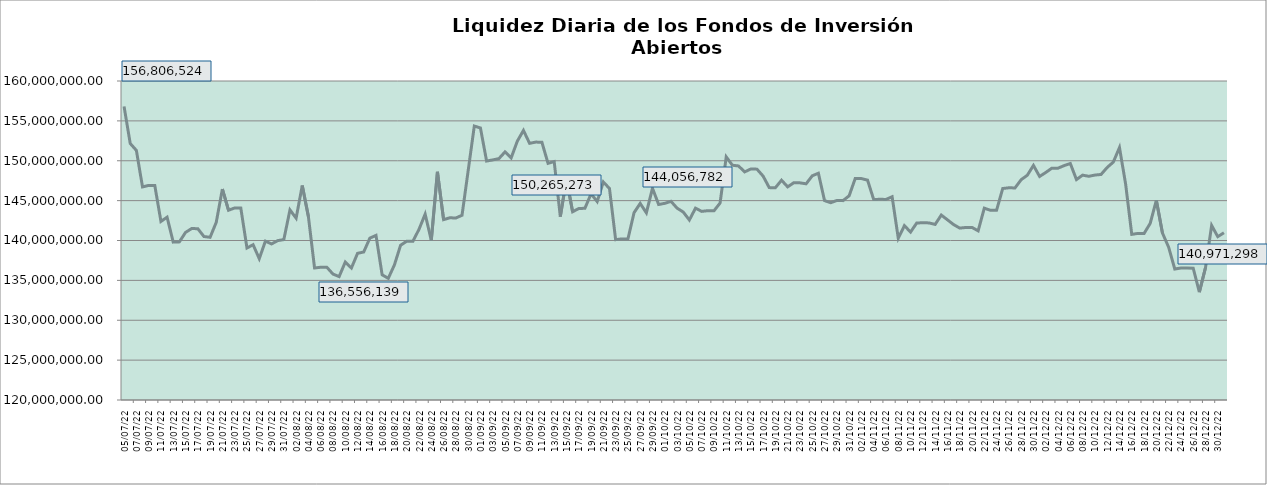
| Category | Series 0 |
|---|---|
| 2022-07-05 | 156806524.49 |
| 2022-07-06 | 152166188.48 |
| 2022-07-07 | 151298427.46 |
| 2022-07-08 | 146718388.68 |
| 2022-07-09 | 146906560.5 |
| 2022-07-10 | 146895893.61 |
| 2022-07-11 | 142390484.34 |
| 2022-07-12 | 142924126.91 |
| 2022-07-13 | 139798512.51 |
| 2022-07-14 | 139826772.85 |
| 2022-07-15 | 141012376.84 |
| 2022-07-16 | 141499989.51 |
| 2022-07-17 | 141481194.86 |
| 2022-07-18 | 140498568.48 |
| 2022-07-19 | 140401207.74 |
| 2022-07-20 | 142275364.88 |
| 2022-07-21 | 146450587.38 |
| 2022-07-22 | 143794474.76 |
| 2022-07-23 | 144080825.08 |
| 2022-07-24 | 144062047.68 |
| 2022-07-25 | 139060510.76 |
| 2022-07-26 | 139471590.52 |
| 2022-07-27 | 137721302.91 |
| 2022-07-28 | 139919280.78 |
| 2022-07-29 | 139568736.89 |
| 2022-07-30 | 139982933.86 |
| 2022-07-31 | 140114452.78 |
| 2022-08-01 | 143840545.85 |
| 2022-08-02 | 142799577.05 |
| 2022-08-03 | 146891267.79 |
| 2022-08-04 | 142993752.64 |
| 2022-08-05 | 136556139.26 |
| 2022-08-06 | 136644296.55 |
| 2022-08-07 | 136646424 |
| 2022-08-08 | 135790833.37 |
| 2022-08-09 | 135475605.73 |
| 2022-08-10 | 137296693.81 |
| 2022-08-11 | 136549063.65 |
| 2022-08-12 | 138392201.22 |
| 2022-08-13 | 138557442.07 |
| 2022-08-14 | 140298226.49 |
| 2022-08-15 | 140639460.73 |
| 2022-08-16 | 135699179.74 |
| 2022-08-17 | 135253716.22 |
| 2022-08-18 | 136946666.9 |
| 2022-08-19 | 139398234.34 |
| 2022-08-20 | 139913342.51 |
| 2022-08-21 | 139893093.17 |
| 2022-08-22 | 141401922.07 |
| 2022-08-23 | 143307196.57 |
| 2022-08-24 | 140014899.02 |
| 2022-08-25 | 148618197.67 |
| 2022-08-26 | 142614612.37 |
| 2022-08-27 | 142845230.55 |
| 2022-08-28 | 142826122.8 |
| 2022-08-29 | 143162664.18 |
| 2022-08-30 | 148752461.69 |
| 2022-08-31 | 154351717.34 |
| 2022-09-01 | 154109551.04 |
| 2022-09-02 | 149965279.33 |
| 2022-09-03 | 150103575.44 |
| 2022-09-04 | 150265272.84 |
| 2022-09-05 | 151110944.7 |
| 2022-09-06 | 150364806.53 |
| 2022-09-07 | 152452636.39 |
| 2022-09-08 | 153801304.58 |
| 2022-09-09 | 152182406.54 |
| 2022-09-10 | 152340161.14 |
| 2022-09-11 | 152320029.52 |
| 2022-09-12 | 149676135.33 |
| 2022-09-13 | 149897021.93 |
| 2022-09-14 | 142993666.96 |
| 2022-09-15 | 147711222.15 |
| 2022-09-16 | 143604340.44 |
| 2022-09-17 | 144009366.86 |
| 2022-09-18 | 144038638.79 |
| 2022-09-19 | 145851322 |
| 2022-09-20 | 144882262.01 |
| 2022-09-21 | 147337894.96 |
| 2022-09-22 | 146519809.95 |
| 2022-09-23 | 140106782.07 |
| 2022-09-24 | 140203168.66 |
| 2022-09-25 | 140184088.24 |
| 2022-09-26 | 143491403.5 |
| 2022-09-27 | 144647310.78 |
| 2022-09-28 | 143469891.15 |
| 2022-09-29 | 146545567.56 |
| 2022-09-30 | 144514338.96 |
| 2022-10-01 | 144660654.28 |
| 2022-10-02 | 144917777.94 |
| 2022-10-03 | 144056782.41 |
| 2022-10-04 | 143572072.46 |
| 2022-10-05 | 142571347.79 |
| 2022-10-06 | 144054181.07 |
| 2022-10-07 | 143652729.83 |
| 2022-10-08 | 143736829.45 |
| 2022-10-09 | 143717656.38 |
| 2022-10-10 | 144699658.01 |
| 2022-10-11 | 150488722.43 |
| 2022-10-12 | 149437572.09 |
| 2022-10-13 | 149347181.4 |
| 2022-10-14 | 148602831.69 |
| 2022-10-15 | 148966579.89 |
| 2022-10-16 | 148947351.74 |
| 2022-10-17 | 148077262.92 |
| 2022-10-18 | 146631015.7 |
| 2022-10-19 | 146618444.62 |
| 2022-10-20 | 147560039.78 |
| 2022-10-21 | 146726350.66 |
| 2022-10-22 | 147247023.63 |
| 2022-10-23 | 147227803.76 |
| 2022-10-24 | 147109384.11 |
| 2022-10-25 | 148110888.57 |
| 2022-10-26 | 148434854.82 |
| 2022-10-27 | 145004218.31 |
| 2022-10-28 | 144737486.31 |
| 2022-10-29 | 145018412.42 |
| 2022-10-30 | 144999232.06 |
| 2022-10-31 | 145601679.76 |
| 2022-11-01 | 147785182.69 |
| 2022-11-02 | 147764108.94 |
| 2022-11-03 | 147568247.89 |
| 2022-11-04 | 145136226.74 |
| 2022-11-05 | 145167548.7 |
| 2022-11-06 | 145148403.42 |
| 2022-11-07 | 145488611.42 |
| 2022-11-08 | 140283718.3 |
| 2022-11-09 | 141864671.75 |
| 2022-11-10 | 141055144.54 |
| 2022-11-11 | 142194968.98 |
| 2022-11-12 | 142225217.67 |
| 2022-11-13 | 142206003.57 |
| 2022-11-14 | 142017183.53 |
| 2022-11-15 | 143189642.18 |
| 2022-11-16 | 142595655.42 |
| 2022-11-17 | 141999327.45 |
| 2022-11-18 | 141555573.57 |
| 2022-11-19 | 141633680.15 |
| 2022-11-20 | 141638433.35 |
| 2022-11-21 | 141211693.15 |
| 2022-11-22 | 144055485.27 |
| 2022-11-23 | 143785506.04 |
| 2022-11-24 | 143801121.43 |
| 2022-11-25 | 146518359.53 |
| 2022-11-26 | 146610425.03 |
| 2022-11-27 | 146590802.27 |
| 2022-11-28 | 147625241.53 |
| 2022-11-29 | 148181084.77 |
| 2022-11-30 | 149414433.69 |
| 2022-12-01 | 148030805.95 |
| 2022-12-02 | 148528517.38 |
| 2022-12-03 | 149074518.25 |
| 2022-12-04 | 149069938.93 |
| 2022-12-05 | 149392149.59 |
| 2022-12-06 | 149654402.66 |
| 2022-12-07 | 147640887.93 |
| 2022-12-08 | 148195325.19 |
| 2022-12-09 | 148051357.61 |
| 2022-12-10 | 148206087.33 |
| 2022-12-11 | 148280411.56 |
| 2022-12-12 | 149160038.39 |
| 2022-12-13 | 149835397.89 |
| 2022-12-14 | 151654257.63 |
| 2022-12-15 | 147083814.07 |
| 2022-12-16 | 140767878.6 |
| 2022-12-17 | 140889666.93 |
| 2022-12-18 | 140870544.6 |
| 2022-12-19 | 142147816.34 |
| 2022-12-20 | 145036858.84 |
| 2022-12-21 | 140918253.54 |
| 2022-12-22 | 139162651.73 |
| 2022-12-23 | 136429043.78 |
| 2022-12-24 | 136564185.45 |
| 2022-12-25 | 136545224.59 |
| 2022-12-26 | 136526299.07 |
| 2022-12-27 | 133515945.97 |
| 2022-12-28 | 136591501.47 |
| 2022-12-29 | 141882392.55 |
| 2022-12-30 | 140472839.97 |
| 2022-12-31 | 140971298.41 |